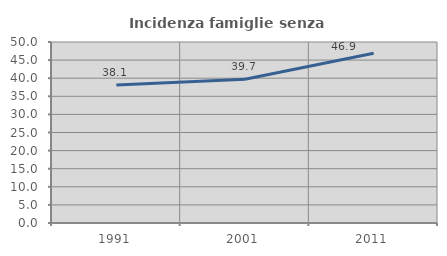
| Category | Incidenza famiglie senza nuclei |
|---|---|
| 1991.0 | 38.095 |
| 2001.0 | 39.716 |
| 2011.0 | 46.875 |